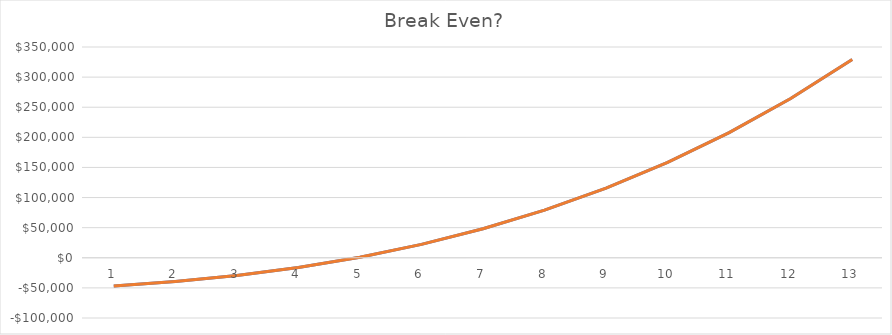
| Category | Payback | With Req Ret |
|---|---|---|
| 0 | -47000 | -47000 |
| 1 | -39275 | -39275 |
| 2 | -29422.725 | -29422.725 |
| 3 | -16117.039 | -16117.039 |
| 4 | 996.912 | 996.912 |
| 5 | 22305.105 | 22305.105 |
| 6 | 48227.241 | 48227.241 |
| 7 | 79219.565 | 79219.565 |
| 8 | 115777.909 | 115777.909 |
| 9 | 158440.998 | 158440.998 |
| 10 | 207794.01 | 207794.01 |
| 11 | 264472.451 | 264472.451 |
| 12 | 329166.324 | 329166.324 |